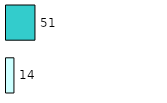
| Category | Series 0 | Series 1 |
|---|---|---|
| 0 | 14 | 51 |